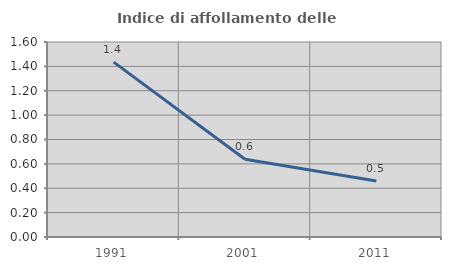
| Category | Indice di affollamento delle abitazioni  |
|---|---|
| 1991.0 | 1.435 |
| 2001.0 | 0.639 |
| 2011.0 | 0.46 |